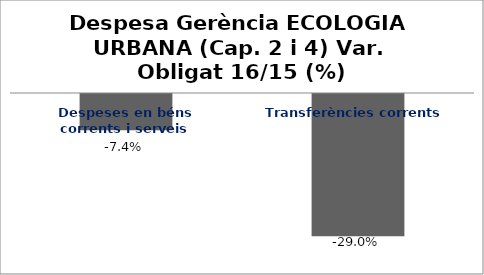
| Category | Series 0 |
|---|---|
| Despeses en béns corrents i serveis | -0.074 |
| Transferències corrents | -0.29 |